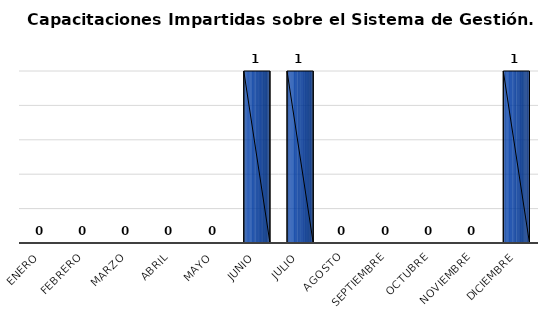
| Category | Capacitaciones impartidas/1 |
|---|---|
| Enero | 0 |
| Febrero | 0 |
| Marzo | 0 |
| Abril | 0 |
| Mayo | 0 |
| Junio | 1 |
| Julio | 1 |
| Agosto | 0 |
| Septiembre | 0 |
| Octubre | 0 |
| Noviembre | 0 |
| Diciembre | 1 |